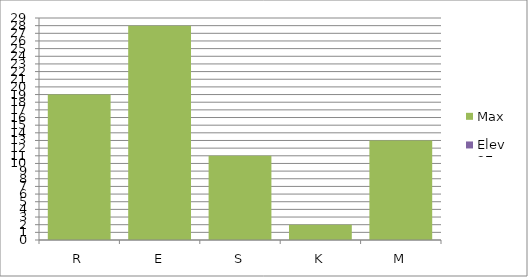
| Category | Max | Elev 27 |
|---|---|---|
| R | 19 | 0 |
| E | 28 | 0 |
| S | 11 | 0 |
| K | 2 | 0 |
| M | 13 | 0 |